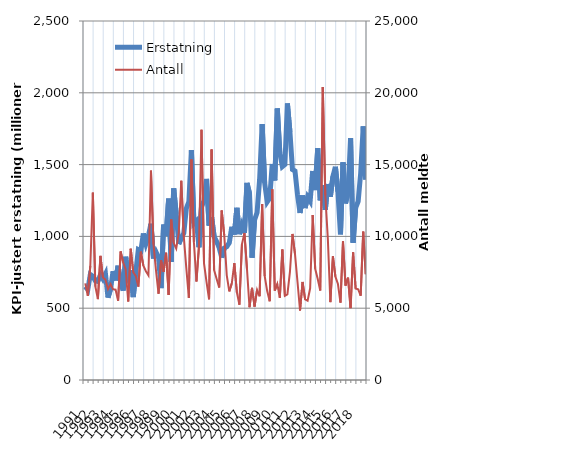
| Category | Erstatning |
|---|---|
| 1991.0 | 650.648 |
| nan | 629.43 |
| nan | 734.421 |
| nan | 721.938 |
| 1992.0 | 690.768 |
| nan | 686.357 |
| nan | 732.841 |
| nan | 703.455 |
| 1993.0 | 738.657 |
| nan | 573.657 |
| nan | 632.921 |
| nan | 757.464 |
| 1994.0 | 693.558 |
| nan | 795.624 |
| nan | 681.909 |
| nan | 622.598 |
| 1995.0 | 858.103 |
| nan | 725.295 |
| nan | 765.293 |
| nan | 577.138 |
| 1996.0 | 751.945 |
| nan | 908.415 |
| nan | 899.355 |
| nan | 1020.479 |
| 1997.0 | 949.161 |
| nan | 1003.74 |
| nan | 1088.191 |
| nan | 846 |
| 1998.0 | 891.248 |
| nan | 854.067 |
| nan | 640.093 |
| nan | 1082.595 |
| 1999.0 | 1003.069 |
| nan | 1263.121 |
| nan | 822.903 |
| nan | 1334.104 |
| 2000.0 | 1156.953 |
| nan | 946.831 |
| nan | 989.887 |
| nan | 1021.591 |
| 2001.0 | 1194.144 |
| nan | 1243.018 |
| nan | 1600.525 |
| nan | 1090.774 |
| 2002.0 | 1107.878 |
| nan | 924.647 |
| nan | 1206.522 |
| nan | 1247.951 |
| 2003.0 | 1400.268 |
| nan | 1074.864 |
| nan | 1134.634 |
| nan | 999.249 |
| 2004.0 | 963.726 |
| nan | 921.914 |
| nan | 852.553 |
| nan | 918.486 |
| 2005.0 | 928.439 |
| nan | 955.172 |
| nan | 1067.054 |
| nan | 1012.587 |
| 2006.0 | 1199.028 |
| nan | 1015.548 |
| nan | 1076.989 |
| nan | 1024.518 |
| 2007.0 | 1371.989 |
| nan | 1299.703 |
| nan | 851.519 |
| nan | 1113.965 |
| 2008.0 | 1166.754 |
| nan | 1395.909 |
| nan | 1782.351 |
| nan | 1373.023 |
| 2009.0 | 1239.722 |
| nan | 1265.696 |
| nan | 1504.367 |
| nan | 1389.958 |
| 2010.0 | 1890.587 |
| nan | 1582.148 |
| nan | 1485.47 |
| nan | 1499.799 |
| 2011.0 | 1925.715 |
| nan | 1727.709 |
| nan | 1466.19 |
| nan | 1455.486 |
| 2012.0 | 1289.19 |
| nan | 1163.089 |
| nan | 1285.325 |
| nan | 1197.586 |
| 2013.0 | 1274.225 |
| nan | 1245.98 |
| nan | 1455.531 |
| nan | 1322.905 |
| 2014.0 | 1613.943 |
| nan | 1251.164 |
| nan | 1357.353 |
| nan | 1184.708 |
| 2015.0 | 1364.912 |
| nan | 1275.895 |
| nan | 1416.944 |
| nan | 1484.685 |
| 2016.0 | 1310.689 |
| nan | 1014.193 |
| nan | 1516.078 |
| nan | 1229.613 |
| 2017.0 | 1307.073 |
| nan | 1684.101 |
| nan | 955.943 |
| nan | 1198.504 |
| 2018.0 | 1244.297 |
| nan | 1440.731 |
| nan | 1766.211 |
| nan | 1395.359 |